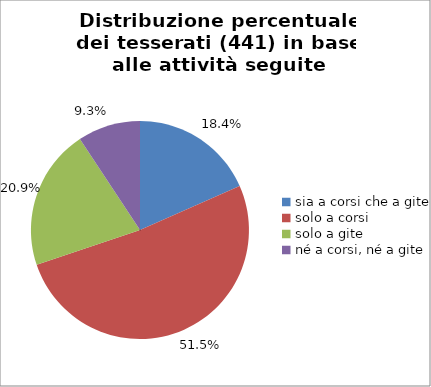
| Category | Nr. Tesserati |
|---|---|
| sia a corsi che a gite | 81 |
| solo a corsi | 227 |
| solo a gite | 92 |
| né a corsi, né a gite | 41 |